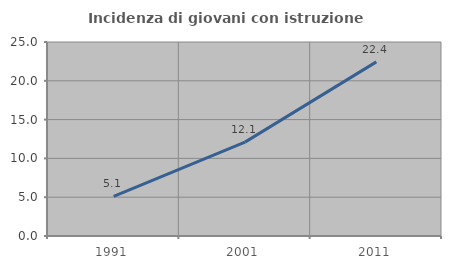
| Category | Incidenza di giovani con istruzione universitaria |
|---|---|
| 1991.0 | 5.098 |
| 2001.0 | 12.097 |
| 2011.0 | 22.439 |